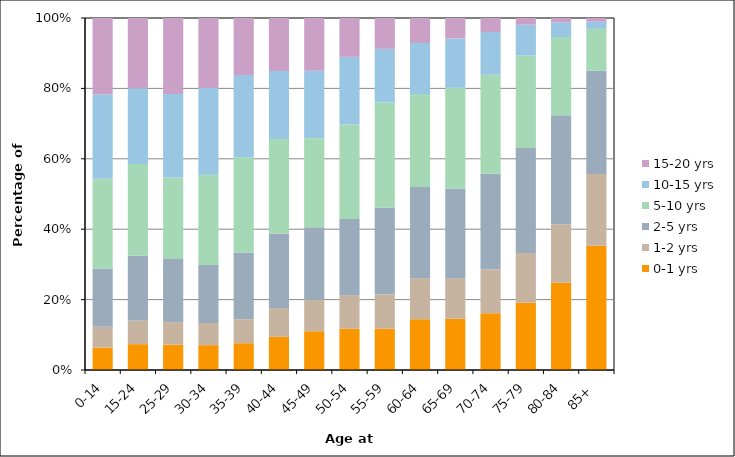
| Category | 0-1 yrs | 1-2 yrs | 2-5 yrs | 5-10 yrs | 10-15 yrs | 15-20 yrs |
|---|---|---|---|---|---|---|
| 0-14 | 764 | 708 | 1996 | 3055 | 2880 | 2610 |
| 15-24 | 1029 | 945 | 2573 | 3653 | 3014 | 2794 |
| 25-29 | 961 | 856 | 2396 | 3087 | 3168 | 2878 |
| 30-34 | 1174 | 1047 | 2737 | 4270 | 4093 | 3305 |
| 35-39 | 1543 | 1384 | 3830 | 5475 | 4735 | 3281 |
| 40-44 | 2369 | 2060 | 5315 | 6752 | 4857 | 3789 |
| 45-49 | 3739 | 3017 | 7001 | 8584 | 6513 | 5086 |
| 50-54 | 5981 | 4865 | 11054 | 13672 | 9803 | 5638 |
| 55-59 | 9671 | 8055 | 20349 | 24592 | 12524 | 7241 |
| 60-64 | 16866 | 13618 | 30316 | 30850 | 16933 | 8291 |
| 65-69 | 19281 | 15249 | 33762 | 37880 | 18540 | 7680 |
| 70-74 | 19394 | 14974 | 32683 | 33824 | 14536 | 4814 |
| 75-79 | 16710 | 12412 | 26111 | 23006 | 7706 | 1666 |
| 80-84 | 10908 | 7347 | 13648 | 9782 | 1844 | 541 |
| 85+ | 6957 | 4023 | 5774 | 2349 | 402 | 208 |